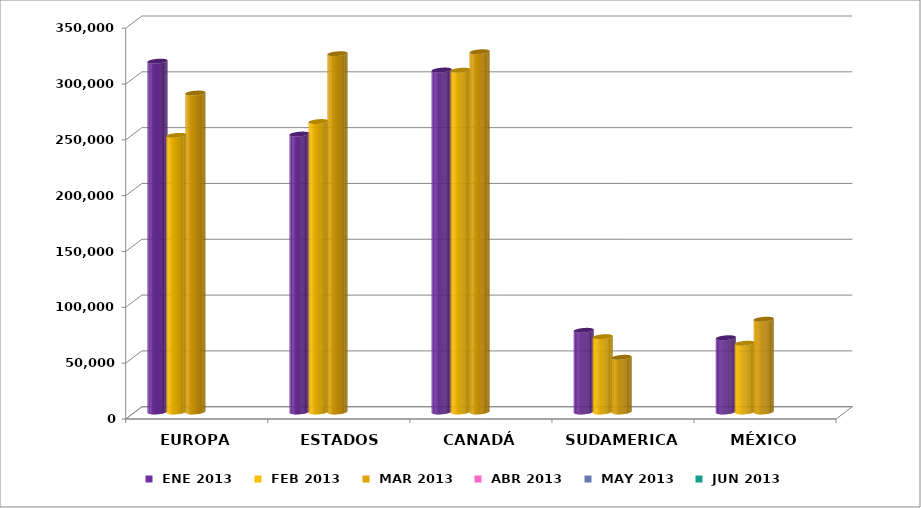
| Category |  ENE 2013 |  FEB 2013 |  MAR 2013 |  ABR 2013 |  MAY 2013 |  JUN 2013 |
|---|---|---|---|---|---|---|
| EUROPA | 314281 | 247793 | 285718 |  |  |  |
| ESTADOS UNIDOS | 248959.375 | 260162 | 320931 |  |  |  |
| CANADÁ | 306323 | 306164 | 322699 |  |  |  |
| SUDAMERICA | 73174 | 67472 | 48998 |  |  |  |
| MÉXICO | 66523.975 | 61603 | 83127 |  |  |  |